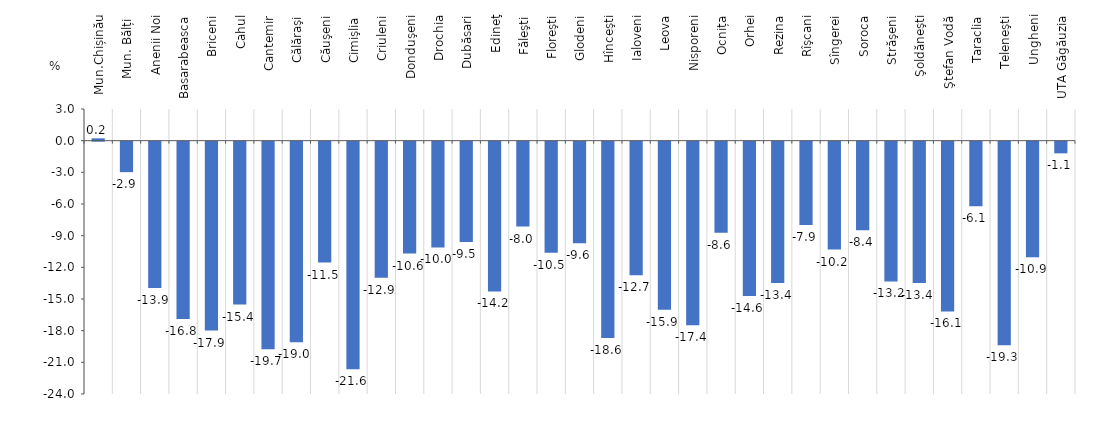
| Category | diferență |
|---|---|
| Mun.Chișinău | 0.22 |
| Mun. Bălți  | -2.887 |
| Anenii Noi | -13.866 |
| Basarabeasca | -16.798 |
| Briceni | -17.893 |
| Cahul | -15.427 |
| Cantemir | -19.669 |
| Călăraşi | -19.003 |
| Căuşeni | -11.453 |
| Cimişlia | -21.568 |
| Criuleni | -12.9 |
| Donduşeni | -10.602 |
| Drochia | -10.026 |
| Dubăsari | -9.509 |
|  Edineţ | -14.187 |
| Făleşti | -8.044 |
| Floreşti | -10.516 |
| Glodeni | -9.633 |
| Hînceşti | -18.593 |
| Ialoveni | -12.655 |
| Leova | -15.93 |
| Nisporeni | -17.39 |
| Ocnița | -8.629 |
| Orhei | -14.616 |
| Rezina | -13.399 |
| Rîşcani | -7.89 |
| Sîngerei | -10.227 |
| Soroca | -8.397 |
| Străşeni | -13.237 |
| Şoldăneşti | -13.397 |
| Ştefan Vodă | -16.089 |
| Taraclia | -6.119 |
| Teleneşti | -19.296 |
| Ungheni | -10.941 |
| UTA Găgăuzia | -1.105 |